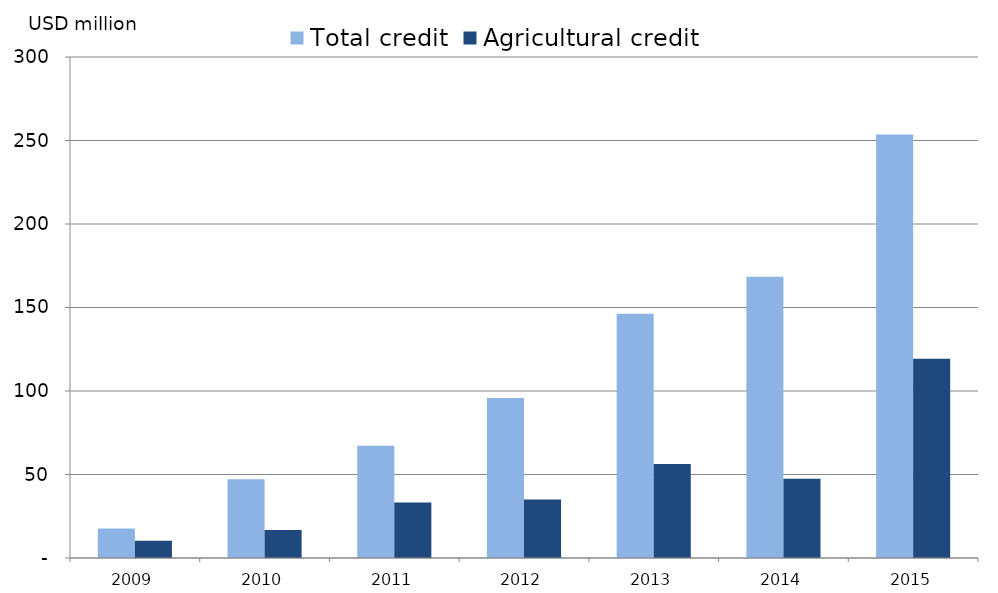
| Category | Total credit | Agricultural credit |
|---|---|---|
| 2009.0 | 17.644 | 10.302 |
| 2010.0 | 47.1 | 16.795 |
| 2011.0 | 67.17 | 33.199 |
| 2012.0 | 95.788 | 35.087 |
| 2013.0 | 146.206 | 56.331 |
| 2014.0 | 168.472 | 47.478 |
| 2015.0 | 253.536 | 119.372 |